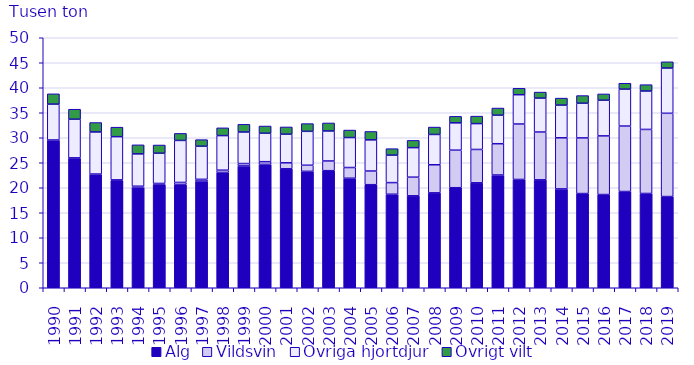
| Category | Älg | Vildsvin | Övriga hjortdjur | Övrigt vilt |
|---|---|---|---|---|
| 1990.0 | 29.516 | 0.038 | 7.172 | 2.058 |
| 1991.0 | 25.913 | 0.066 | 7.734 | 1.995 |
| 1992.0 | 22.67 | 0.073 | 8.416 | 1.885 |
| 1993.0 | 21.398 | 0.178 | 8.637 | 1.903 |
| 1994.0 | 20.117 | 0.187 | 6.471 | 1.808 |
| 1995.0 | 20.688 | 0.173 | 6.051 | 1.637 |
| 1996.0 | 20.644 | 0.419 | 8.402 | 1.405 |
| 1997.0 | 21.34 | 0.347 | 6.62 | 1.314 |
| 1998.0 | 23.061 | 0.451 | 6.923 | 1.547 |
| 1999.0 | 24.364 | 0.477 | 6.306 | 1.536 |
| 2000.0 | 24.676 | 0.539 | 5.693 | 1.438 |
| 2001.0 | 23.79 | 1.198 | 5.726 | 1.445 |
| 2002.0 | 23.278 | 1.222 | 6.787 | 1.542 |
| 2003.0 | 23.415 | 1.941 | 6.001 | 1.602 |
| 2004.0 | 21.905 | 2.139 | 5.993 | 1.502 |
| 2005.0 | 20.615 | 2.732 | 6.232 | 1.674 |
| 2006.0 | 18.701 | 2.328 | 5.489 | 1.3 |
| 2007.0 | 18.385 | 3.733 | 5.903 | 1.451 |
| 2008.0 | 18.981 | 5.617 | 6.064 | 1.474 |
| 2009.0 | 20.007 | 7.509 | 5.467 | 1.296 |
| 2010.0 | 20.985 | 6.672 | 5.173 | 1.495 |
| 2011.0 | 22.547 | 6.262 | 5.709 | 1.424 |
| 2012.0 | 21.658 | 11.091 | 5.858 | 1.282 |
| 2013.0 | 21.582 | 9.562 | 6.793 | 1.197 |
| 2014.0 | 19.77 | 10.219 | 6.536 | 1.401 |
| 2015.0 | 18.84 | 11.129 | 6.942 | 1.525 |
| 2016.0 | 18.641 | 11.733 | 7.134 | 1.255 |
| 2017.0 | 19.246 | 13.091 | 7.39 | 1.178 |
| 2018.0 | 18.854 | 12.808 | 7.686 | 1.268 |
| 2019.0 | 18.24 | 16.652 | 9.052 | 1.246 |